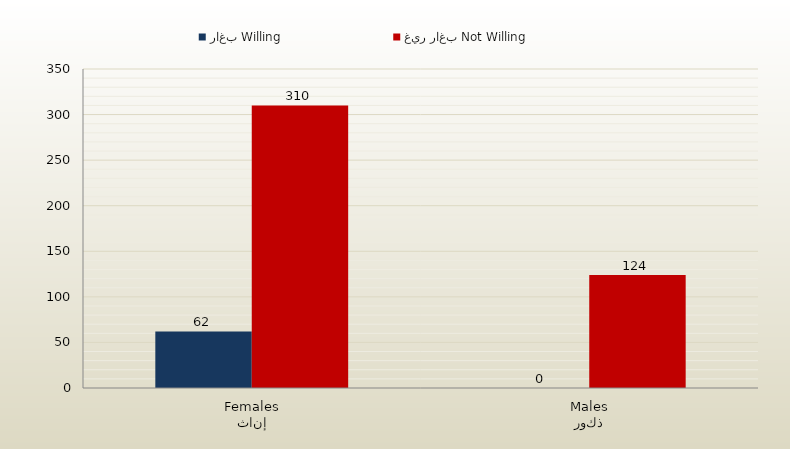
| Category | راغب Willing | غير راغب Not Willing |
|---|---|---|
| إناث
Females | 62 | 310 |
| ذكور
Males | 0 | 124 |